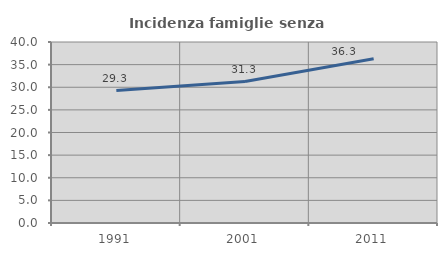
| Category | Incidenza famiglie senza nuclei |
|---|---|
| 1991.0 | 29.278 |
| 2001.0 | 31.265 |
| 2011.0 | 36.312 |